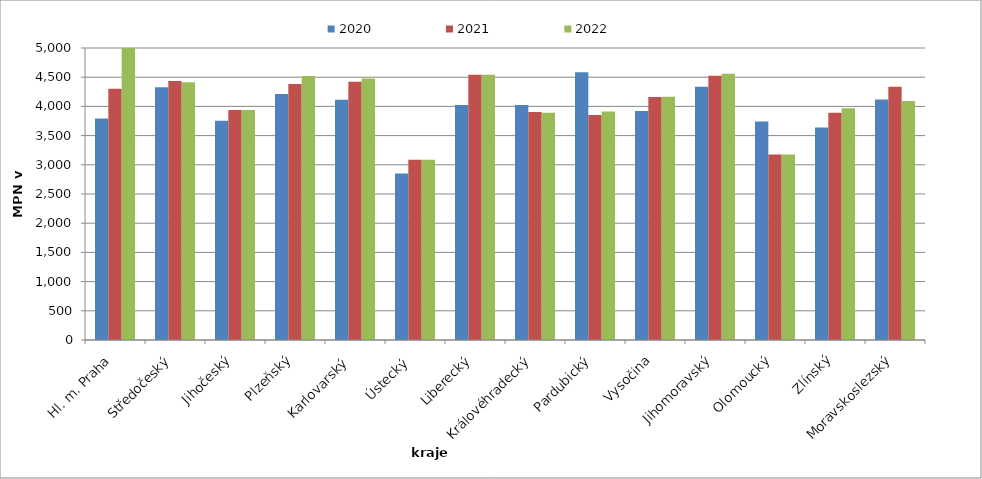
| Category | 2020 | 2021 | 2022 |
|---|---|---|---|
| Hl. m. Praha | 3793 | 4302 | 5785 |
| Středočeský | 4328 | 4437 | 4415 |
| Jihočeský | 3753 | 3937 | 3937 |
| Plzeňský | 4214 | 4385 | 4522 |
| Karlovarský  | 4112 | 4421 | 4476 |
| Ústecký   | 2853 | 3086 | 3086 |
| Liberecký | 4022 | 4543 | 4543 |
| Královéhradecký | 4024 | 3905 | 3890 |
| Pardubický | 4586 | 3852 | 3913 |
| Vysočina | 3923 | 4163 | 4166 |
| Jihomoravský | 4337 | 4526 | 4557 |
| Olomoucký | 3742 | 3177 | 3177 |
| Zlínský | 3638 | 3893 | 3970 |
| Moravskoslezský | 4118 | 4338 | 4092 |